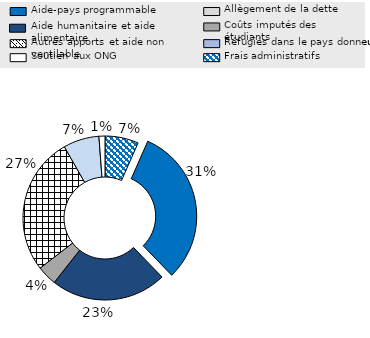
| Category | Series 0 |
|---|---|
| Frais administratifs  | 0.066 |
| Aide-pays programmable | 0.312 |
| Allègement de la dette | 0 |
| Aide humanitaire et aide alimentaire | 0.228 |
| Coûts imputés des étudiants | 0.039 |
| Autres apports et aide non ventilable | 0.272 |
| Réfugiés dans le pays donneur | 0.071 |
| Soutien aux ONG | 0.012 |